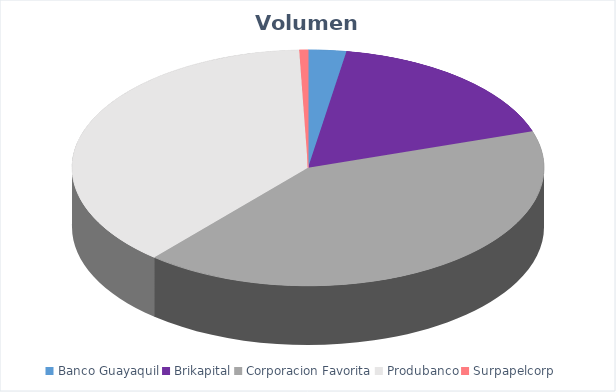
| Category | VOLUMEN ($USD) |
|---|---|
| Banco Guayaquil | 1500 |
| Brikapital | 10000 |
| Corporacion Favorita | 23776.08 |
| Produbanco | 21956.2 |
| Surpapelcorp | 340 |